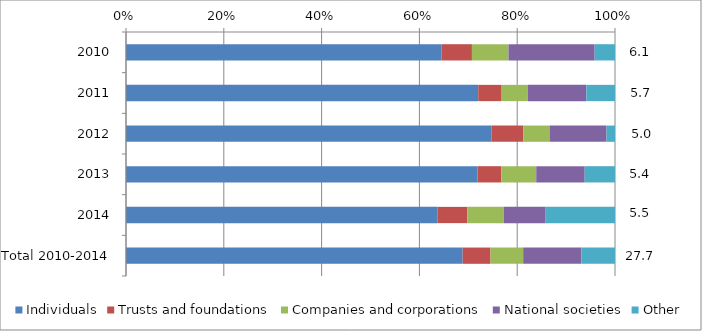
| Category | Individuals | Trusts and foundations | Companies and corporations | National societies | Other |
|---|---|---|---|---|---|
| 2010 | 3.908 | 0.378 | 0.453 | 1.068 | 0.252 |
| 2011 | 4.133 | 0.275 | 0.308 | 0.686 | 0.336 |
| 2012 | 3.737 | 0.324 | 0.267 | 0.582 | 0.087 |
| 2013 | 3.881 | 0.262 | 0.385 | 0.535 | 0.334 |
| 2014 | 3.511 | 0.335 | 0.41 | 0.472 | 0.781 |
| Total 2010-2014 | 19.071 | 1.578 | 1.85 | 3.297 | 1.905 |